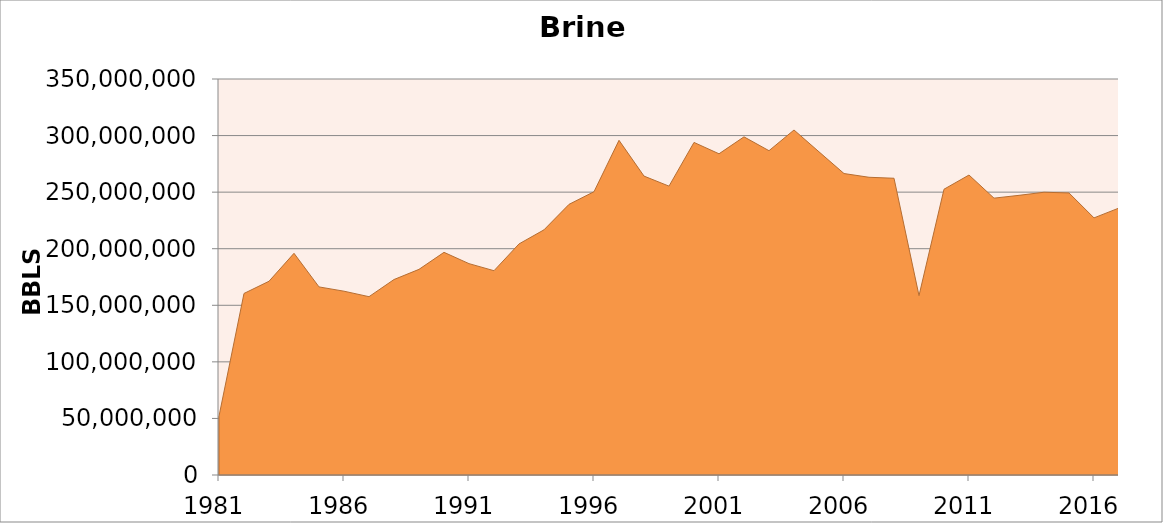
| Category | Brine Production (Bbls) |
|---|---|
| 1981.0 | 51971899 |
| 1982.0 | 160465010 |
| 1983.0 | 171240298 |
| 1984.0 | 195945651 |
| 1985.0 | 166231702 |
| 1986.0 | 162449248 |
| 1987.0 | 157603103 |
| 1988.0 | 172764613 |
| 1989.0 | 181759894 |
| 1990.0 | 196800846 |
| 1991.0 | 186821272 |
| 1992.0 | 180557630 |
| 1993.0 | 204231428 |
| 1994.0 | 216704064 |
| 1995.0 | 239199530 |
| 1996.0 | 250379303 |
| 1997.0 | 295817469 |
| 1998.0 | 264191117 |
| 1999.0 | 255312276 |
| 2000.0 | 293935423 |
| 2001.0 | 283894022 |
| 2002.0 | 298868492 |
| 2003.0 | 286632846 |
| 2004.0 | 304928695 |
| 2005.0 | 285640255 |
| 2006.0 | 266439960 |
| 2007.0 | 263139075 |
| 2008.0 | 262274334 |
| 2009.0 | 158539167 |
| 2010.0 | 252582031 |
| 2011.0 | 265136009 |
| 2012.0 | 244693745 |
| 2013.0 | 247180766 |
| 2014.0 | 249908343 |
| 2015.0 | 249285151 |
| 2016.0 | 227246295 |
| 2017.0 | 235965807 |